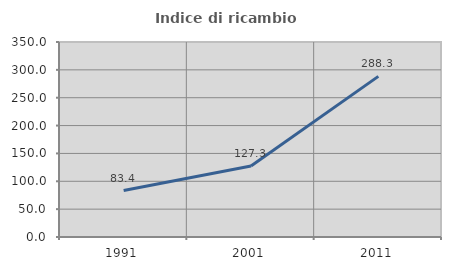
| Category | Indice di ricambio occupazionale  |
|---|---|
| 1991.0 | 83.367 |
| 2001.0 | 127.309 |
| 2011.0 | 288.295 |